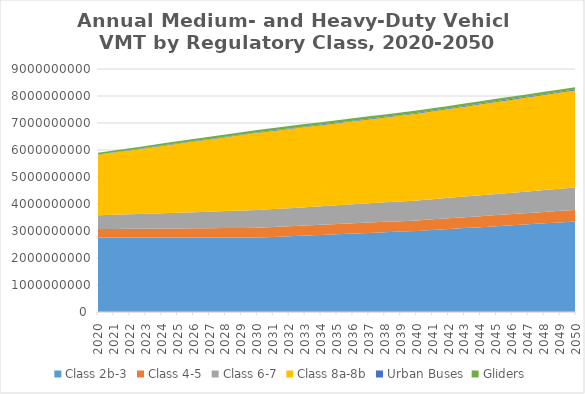
| Category | Class 2b-3 | Class 4-5 | Class 6-7 | Class 8a-8b | Urban Buses | Gliders |
|---|---|---|---|---|---|---|
| 2020.0 | 2757716825.692 | 312620878.168 | 510969792.538 | 2242129296.308 | 13464087.039 | 60738874.139 |
| 2021.0 | 2757426678.923 | 317832466.62 | 525483559.26 | 2303925069.077 | 14230905.562 | 63372336.972 |
| 2022.0 | 2757136532.154 | 323044055.072 | 539997325.981 | 2365720841.846 | 14997724.084 | 66005799.805 |
| 2023.0 | 2756846385.385 | 328255643.524 | 554511092.702 | 2427516614.615 | 15764542.606 | 68639262.638 |
| 2024.0 | 2756556238.615 | 333467231.976 | 569024859.423 | 2489312387.385 | 16531361.128 | 71272725.471 |
| 2025.0 | 2756266091.846 | 338678820.428 | 583538626.144 | 2551108160.154 | 17298179.651 | 73906188.304 |
| 2026.0 | 2755975945.077 | 343890408.88 | 598052392.865 | 2612903932.923 | 18064998.173 | 76539651.137 |
| 2027.0 | 2755685798.308 | 349101997.332 | 612566159.587 | 2674699705.692 | 18831816.695 | 79173113.97 |
| 2028.0 | 2755395651.538 | 354313585.784 | 627079926.308 | 2736495478.462 | 19598635.217 | 81806576.803 |
| 2029.0 | 2755105504.769 | 359525174.236 | 641593693.029 | 2798291251.231 | 20365453.739 | 84440039.636 |
| 2030.0 | 2754815358 | 364736762.688 | 656107459.75 | 2860087024 | 21132272.262 | 87073502.469 |
| 2031.0 | 2779662186.2 | 367223156.794 | 664435418.175 | 2895402449.1 | 21631214.125 | 87259745.453 |
| 2032.0 | 2804509014.4 | 369709550.9 | 672763376.6 | 2930717874.2 | 22130155.988 | 87445988.438 |
| 2033.0 | 2829355842.6 | 372195945.006 | 681091335.025 | 2966033299.3 | 22629097.852 | 87632231.422 |
| 2034.0 | 2854202670.8 | 374682339.112 | 689419293.45 | 3001348724.4 | 23128039.715 | 87818474.406 |
| 2035.0 | 2879049499 | 377168733.219 | 697747251.875 | 3036664149.5 | 23626981.578 | 88004717.391 |
| 2036.0 | 2903896327.2 | 379655127.325 | 706075210.3 | 3071979574.6 | 24125923.441 | 88190960.375 |
| 2037.0 | 2928743155.4 | 382141521.431 | 714403168.725 | 3107294999.7 | 24624865.305 | 88377203.359 |
| 2038.0 | 2953589983.6 | 384627915.538 | 722731127.15 | 3142610424.8 | 25123807.168 | 88563446.344 |
| 2039.0 | 2978436811.8 | 387114309.644 | 731059085.575 | 3177925849.9 | 25622749.031 | 88749689.328 |
| 2040.0 | 3003283640 | 389600703.75 | 739387044 | 3213241275 | 26121690.895 | 88935932.312 |
| 2041.0 | 3038296079 | 393759277.125 | 748013756.575 | 3252090188.8 | 26518996.708 | 88722498.609 |
| 2042.0 | 3073308518 | 397917850.5 | 756640469.15 | 3290939102.6 | 26916302.522 | 88509064.906 |
| 2043.0 | 3108320957 | 402076423.875 | 765267181.725 | 3329788016.4 | 27313608.336 | 88295631.203 |
| 2044.0 | 3143333396 | 406234997.25 | 773893894.3 | 3368636930.2 | 27710914.149 | 88082197.5 |
| 2045.0 | 3178345835 | 410393570.625 | 782520606.875 | 3407485844 | 28108219.963 | 87868763.797 |
| 2046.0 | 3213358274 | 414552144 | 791147319.45 | 3446334757.8 | 28505525.777 | 87655330.094 |
| 2047.0 | 3248370713 | 418710717.375 | 799774032.025 | 3485183671.6 | 28902831.59 | 87441896.391 |
| 2048.0 | 3283383152 | 422869290.75 | 808400744.6 | 3524032585.4 | 29300137.404 | 87228462.688 |
| 2049.0 | 3318395591 | 427027864.125 | 817027457.175 | 3562881499.2 | 29697443.218 | 87015028.984 |
| 2050.0 | 3353408030 | 431186437.5 | 825654169.75 | 3601730413 | 30094749.031 | 86801595.281 |